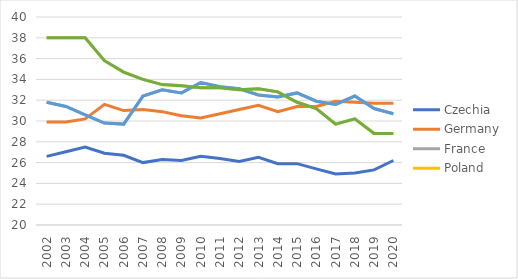
| Category | Czechia | Germany | France | Poland | Series 4 | Series 5 |
|---|---|---|---|---|---|---|
| 2002 | 26.6 | 29.9 | 31.8 | 38 | 31.8 | 38 |
| 2003 | 27.05 | 29.9 | 31.4 | 38 | 31.4 | 38 |
| 2004 | 27.5 | 30.2 | 30.6 | 38 | 30.6 | 38 |
| 2005 | 26.9 | 31.6 | 29.8 | 35.8 | 29.8 | 35.8 |
| 2006 | 26.7 | 31 | 29.7 | 34.7 | 29.7 | 34.7 |
| 2007 | 26 | 31.1 | 32.4 | 34 | 32.4 | 34 |
| 2008 | 26.3 | 30.9 | 33 | 33.5 | 33 | 33.5 |
| 2009 | 26.2 | 30.5 | 32.7 | 33.4 | 32.7 | 33.4 |
| 2010 | 26.6 | 30.3 | 33.7 | 33.2 | 33.7 | 33.2 |
| 2011 | 26.4 | 30.7 | 33.3 | 33.2 | 33.3 | 33.2 |
| 2012 | 26.1 | 31.1 | 33.1 | 33 | 33.1 | 33 |
| 2013 | 26.5 | 31.5 | 32.5 | 33.1 | 32.5 | 33.1 |
| 2014 | 25.9 | 30.9 | 32.3 | 32.8 | 32.3 | 32.8 |
| 2015 | 25.9 | 31.4 | 32.7 | 31.8 | 32.7 | 31.8 |
| 2016 | 25.4 | 31.4 | 31.9 | 31.2 | 31.9 | 31.2 |
| 2017 | 24.9 | 31.9 | 31.6 | 29.7 | 31.6 | 29.7 |
| 2018 | 25 | 31.8 | 32.4 | 30.2 | 32.4 | 30.2 |
| 2019 | 25.3 | 31.7 | 31.2 | 28.8 | 31.2 | 28.8 |
| 2020 | 26.2 | 31.7 | 30.7 | 28.8 | 30.7 | 28.8 |